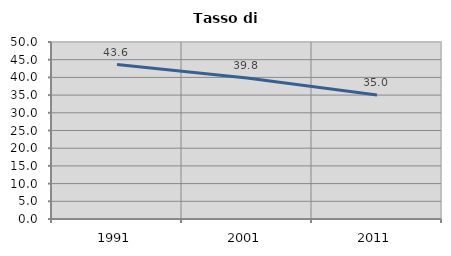
| Category | Tasso di disoccupazione   |
|---|---|
| 1991.0 | 43.639 |
| 2001.0 | 39.847 |
| 2011.0 | 35.028 |